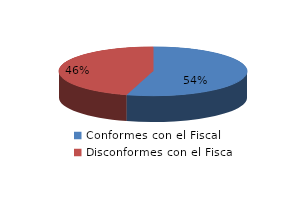
| Category | Series 0 |
|---|---|
| 0 | 297 |
| 1 | 248 |